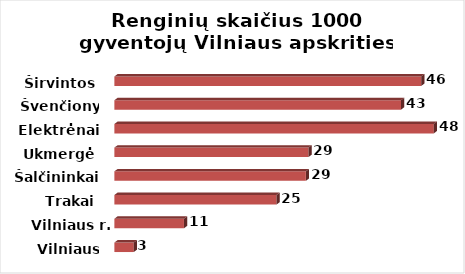
| Category | Series 0 |
|---|---|
| Vilniaus m. | 2.939 |
| Vilniaus r. | 10.532 |
| Trakai | 24.544 |
| Šalčininkai | 28.988 |
| Ukmergė | 29.383 |
| Elektrėnai | 48.354 |
| Švenčionys | 43.393 |
| Širvintos | 46.456 |